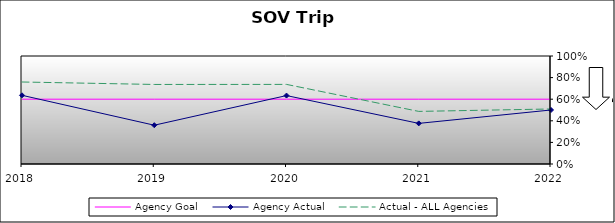
| Category | Agency Goal | Agency Actual | Actual - ALL Agencies |
|---|---|---|---|
| 2018.0 | 0.6 | 0.636 | 0.759 |
| 2019.0 | 0.6 | 0.359 | 0.736 |
| 2020.0 | 0.6 | 0.634 | 0.737 |
| 2021.0 | 0.6 | 0.376 | 0.487 |
| 2022.0 | 0.6 | 0.5 | 0.509 |